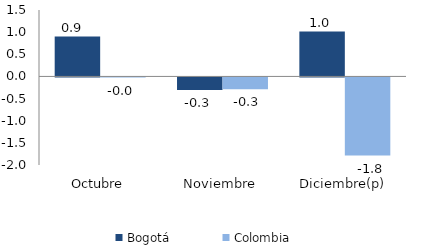
| Category | Bogotá | Colombia |
|---|---|---|
| Octubre | 0.9 | -0.002 |
| Noviembre | -0.286 | -0.268 |
| Diciembre(p) | 1.012 | -1.764 |